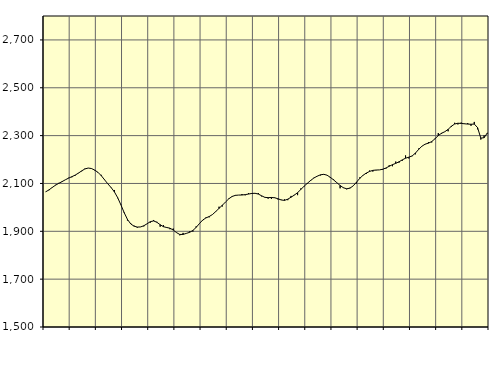
| Category | Piggar | Series 1 |
|---|---|---|
| nan | 2064.3 | 2064.78 |
| 87.0 | 2071.5 | 2073.1 |
| 87.0 | 2081.8 | 2083 |
| 87.0 | 2094.2 | 2092.59 |
| nan | 2102.5 | 2100.34 |
| 88.0 | 2106.4 | 2107.5 |
| 88.0 | 2115.4 | 2115.23 |
| 88.0 | 2123.7 | 2122.23 |
| nan | 2125.8 | 2128.19 |
| 89.0 | 2132.4 | 2134.74 |
| 89.0 | 2144.1 | 2143.06 |
| 89.0 | 2150.8 | 2152.45 |
| nan | 2162.1 | 2160.6 |
| 90.0 | 2164.4 | 2164.49 |
| 90.0 | 2161.6 | 2162.44 |
| 90.0 | 2154.4 | 2155.98 |
| nan | 2147.6 | 2146.3 |
| 91.0 | 2135.9 | 2132.57 |
| 91.0 | 2116.9 | 2115.5 |
| 91.0 | 2098.9 | 2098.54 |
| nan | 2081.7 | 2083.09 |
| 92.0 | 2072.7 | 2065.15 |
| 92.0 | 2038.4 | 2041.03 |
| 92.0 | 2012.4 | 2010.73 |
| nan | 1980.1 | 1978.08 |
| 93.0 | 1945.1 | 1949.94 |
| 93.0 | 1933.8 | 1930.96 |
| 93.0 | 1923.7 | 1921.59 |
| nan | 1915.2 | 1917.77 |
| 94.0 | 1918.5 | 1918.19 |
| 94.0 | 1920.7 | 1923.23 |
| 94.0 | 1931.4 | 1931.52 |
| nan | 1936.2 | 1940.31 |
| 95.0 | 1947.3 | 1943.38 |
| 95.0 | 1939.7 | 1937.77 |
| 95.0 | 1919.2 | 1927.63 |
| nan | 1925.8 | 1919.27 |
| 96.0 | 1914.3 | 1915.89 |
| 96.0 | 1908.7 | 1912.99 |
| 96.0 | 1911.4 | 1905.23 |
| nan | 1893.8 | 1894.56 |
| 97.0 | 1883.3 | 1886.83 |
| 97.0 | 1893.3 | 1887.03 |
| 97.0 | 1891.8 | 1891.23 |
| nan | 1899.6 | 1895.78 |
| 98.0 | 1898.9 | 1903.56 |
| 98.0 | 1920.5 | 1916.37 |
| 98.0 | 1931.3 | 1932.26 |
| nan | 1945.7 | 1947.08 |
| 99.0 | 1958 | 1955.97 |
| 99.0 | 1958.6 | 1961.88 |
| 99.0 | 1970.8 | 1970.31 |
| nan | 1981.7 | 1982.82 |
| 0.0 | 2002.9 | 1995.95 |
| 0.0 | 2003.7 | 2008.91 |
| 0.0 | 2023 | 2022.83 |
| nan | 2037.6 | 2036.16 |
| 1.0 | 2044.1 | 2045.68 |
| 1.0 | 2051.8 | 2050.3 |
| 1.0 | 2051.5 | 2051.45 |
| nan | 2055.7 | 2051.73 |
| 2.0 | 2050.5 | 2053.39 |
| 2.0 | 2059.8 | 2055.71 |
| 2.0 | 2056.1 | 2058.24 |
| nan | 2058.4 | 2058.89 |
| 3.0 | 2060.1 | 2055.67 |
| 3.0 | 2045.9 | 2048.55 |
| 3.0 | 2042.8 | 2041.95 |
| nan | 2036.5 | 2040.7 |
| 4.0 | 2035.4 | 2041.48 |
| 4.0 | 2041.7 | 2040.15 |
| 4.0 | 2033.2 | 2036.1 |
| nan | 2032.1 | 2030.87 |
| 5.0 | 2033.6 | 2029.25 |
| 5.0 | 2030.1 | 2034.21 |
| 5.0 | 2047.9 | 2042.55 |
| nan | 2052.5 | 2051.34 |
| 6.0 | 2051.1 | 2061.63 |
| 6.0 | 2079.3 | 2074.76 |
| 6.0 | 2087.5 | 2088.71 |
| nan | 2098.6 | 2100.88 |
| 7.0 | 2110.6 | 2112.73 |
| 7.0 | 2123.9 | 2122.91 |
| 7.0 | 2131 | 2130.47 |
| nan | 2133.7 | 2136.16 |
| 8.0 | 2137.2 | 2138.22 |
| 8.0 | 2134.8 | 2134.6 |
| 8.0 | 2123.2 | 2125.67 |
| nan | 2117.4 | 2115.01 |
| 9.0 | 2102.9 | 2103.18 |
| 9.0 | 2079.7 | 2091.5 |
| 9.0 | 2083.3 | 2082.04 |
| nan | 2075.6 | 2077.82 |
| 10.0 | 2081.9 | 2080.29 |
| 10.0 | 2090 | 2089.99 |
| 10.0 | 2100.2 | 2105.23 |
| nan | 2125.3 | 2121.22 |
| 11.0 | 2135 | 2134.1 |
| 11.0 | 2139.7 | 2143.43 |
| 11.0 | 2154 | 2150.25 |
| nan | 2149.7 | 2154.74 |
| 12.0 | 2155.2 | 2156.19 |
| 12.0 | 2156.6 | 2156.65 |
| 12.0 | 2156.9 | 2159.47 |
| nan | 2162 | 2164.63 |
| 13.0 | 2176 | 2171.76 |
| 13.0 | 2172 | 2178.63 |
| 13.0 | 2191.5 | 2183.96 |
| nan | 2186.9 | 2190.64 |
| 14.0 | 2195 | 2198.6 |
| 14.0 | 2217.1 | 2205.56 |
| 14.0 | 2204.5 | 2209.85 |
| nan | 2214 | 2215 |
| 15.0 | 2221.8 | 2226.7 |
| 15.0 | 2246 | 2242.35 |
| 15.0 | 2256.1 | 2255.75 |
| nan | 2263.5 | 2264.35 |
| 16.0 | 2273.1 | 2268.54 |
| 16.0 | 2271.5 | 2275.14 |
| 16.0 | 2285.6 | 2286.94 |
| nan | 2310.6 | 2300.27 |
| 17.0 | 2307.1 | 2309.98 |
| 17.0 | 2315.9 | 2316.34 |
| 17.0 | 2318 | 2326.1 |
| nan | 2336.2 | 2339.09 |
| 18.0 | 2353.6 | 2348.48 |
| 18.0 | 2346.7 | 2351.81 |
| 18.0 | 2354.6 | 2351.02 |
| nan | 2350.7 | 2349.46 |
| 19.0 | 2352.3 | 2348.24 |
| 19.0 | 2341 | 2347.45 |
| 19.0 | 2357.3 | 2348.3 |
| nan | 2326.5 | 2333.48 |
| 20.0 | 2283.6 | 2289.56 |
| 20.0 | 2300.8 | 2291.2 |
| 20.0 | 2309 | 2311.42 |